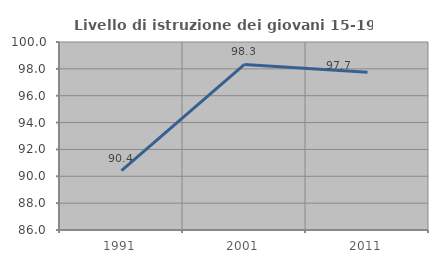
| Category | Livello di istruzione dei giovani 15-19 anni |
|---|---|
| 1991.0 | 90.419 |
| 2001.0 | 98.333 |
| 2011.0 | 97.744 |